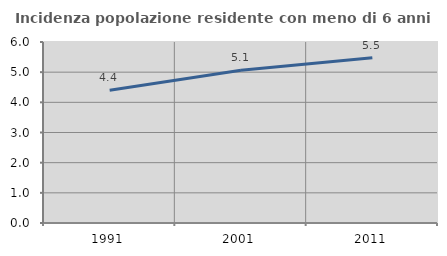
| Category | Incidenza popolazione residente con meno di 6 anni |
|---|---|
| 1991.0 | 4.4 |
| 2001.0 | 5.065 |
| 2011.0 | 5.476 |